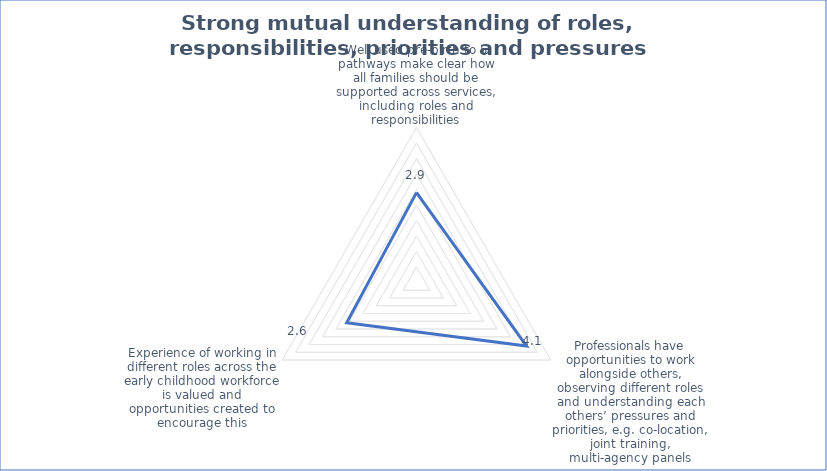
| Category | Series 0 |
|---|---|
| Well used pre-birth to 5 pathways make clear how all families should be supported across services, including roles and responsibilities | 2.9 |
| Professionals have opportunities to work alongside others, observing different roles and understanding each others’ pressures and priorities, e.g. co-location, joint training, multi-agency panels | 4.1 |
| Experience of working in different roles across the early childhood workforce is valued and opportunities created to encourage this | 2.6 |